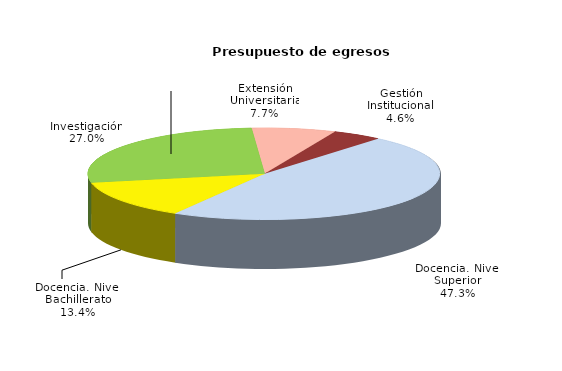
| Category | Series 0 |
|---|---|
| Docencia. Nivel Superior | 22068867296 |
| Docencia. Nivel Bachillerato | 6245167798 |
| Investigación | 12592799472 |
| Extensión Universitaria | 3599130706 |
| Gestión Institucional | 2138880397 |